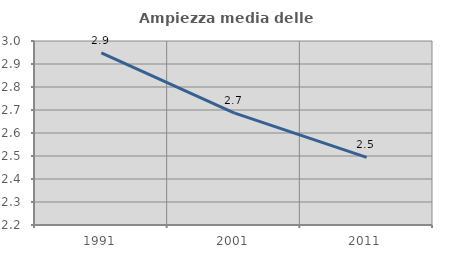
| Category | Ampiezza media delle famiglie |
|---|---|
| 1991.0 | 2.949 |
| 2001.0 | 2.688 |
| 2011.0 | 2.494 |